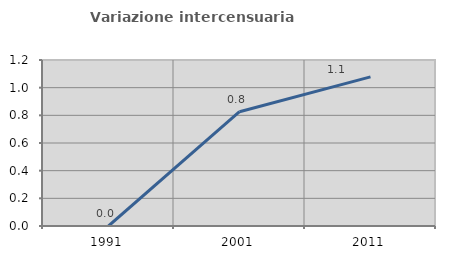
| Category | Variazione intercensuaria annua |
|---|---|
| 1991.0 | 0 |
| 2001.0 | 0.826 |
| 2011.0 | 1.078 |